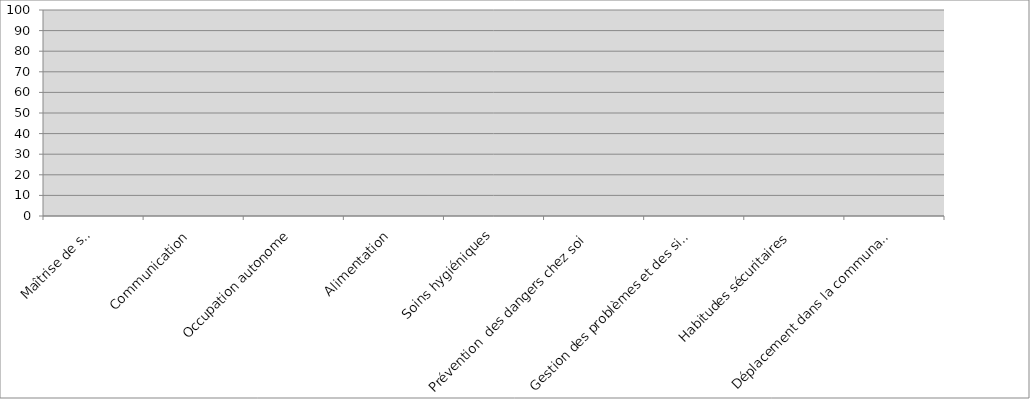
| Category | Série 1 |
|---|---|
| Maîtrise de soi | 0 |
| Communication | 0 |
| Occupation autonome | 0 |
| Alimentation | 0 |
| Soins hygiéniques | 0 |
| Prévention  des dangers chez soi | 0 |
| Gestion des problèmes et des situations  urgentes | 0 |
| Habitudes sécuritaires | 0 |
| Déplacement dans la communauté | 0 |